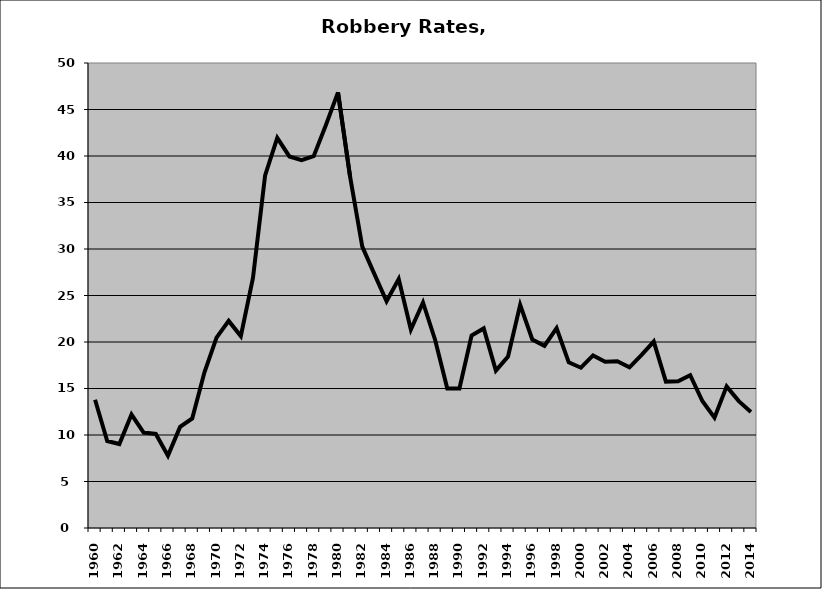
| Category | Robbery |
|---|---|
| 1960.0 | 13.789 |
| 1961.0 | 9.357 |
| 1962.0 | 9.026 |
| 1963.0 | 12.202 |
| 1964.0 | 10.26 |
| 1965.0 | 10.116 |
| 1966.0 | 7.781 |
| 1967.0 | 10.873 |
| 1968.0 | 11.773 |
| 1969.0 | 16.713 |
| 1970.0 | 20.477 |
| 1971.0 | 22.268 |
| 1972.0 | 20.635 |
| 1973.0 | 26.883 |
| 1974.0 | 37.922 |
| 1975.0 | 41.951 |
| 1976.0 | 39.952 |
| 1977.0 | 39.557 |
| 1978.0 | 39.977 |
| 1979.0 | 43.315 |
| 1980.0 | 46.84 |
| 1981.0 | 37.748 |
| 1982.0 | 30.259 |
| 1983.0 | 27.3 |
| 1984.0 | 24.376 |
| 1985.0 | 26.766 |
| 1986.0 | 21.336 |
| 1987.0 | 24.248 |
| 1988.0 | 20.22 |
| 1989.0 | 14.99 |
| 1990.0 | 14.999 |
| 1991.0 | 20.693 |
| 1992.0 | 21.462 |
| 1993.0 | 16.924 |
| 1994.0 | 18.447 |
| 1995.0 | 23.99 |
| 1996.0 | 20.269 |
| 1997.0 | 19.587 |
| 1998.0 | 21.481 |
| 1999.0 | 17.816 |
| 2000.0 | 17.234 |
| 2001.0 | 18.552 |
| 2002.0 | 17.869 |
| 2003.0 | 17.922 |
| 2004.0 | 17.274 |
| 2005.0 | 18.61 |
| 2006.0 | 20.048 |
| 2007.0 | 15.74 |
| 2008.0 | 15.777 |
| 2009.0 | 16.432 |
| 2010.0 | 13.652 |
| 2011.0 | 11.871 |
| 2012.0 | 15.229 |
| 2013.0 | 13.641 |
| 2014.0 | 12.481 |